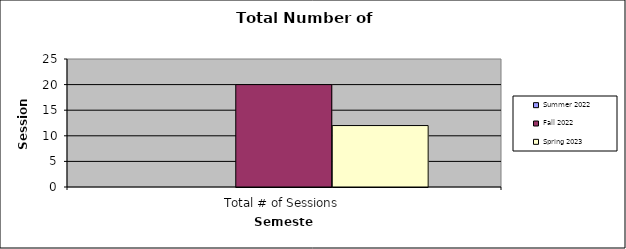
| Category | Summer 2022 | Fall 2022 | Spring 2023 |
|---|---|---|---|
| Total # of Sessions | 0 | 20 | 12 |